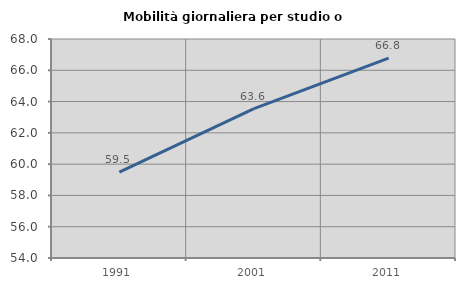
| Category | Mobilità giornaliera per studio o lavoro |
|---|---|
| 1991.0 | 59.485 |
| 2001.0 | 63.553 |
| 2011.0 | 66.777 |